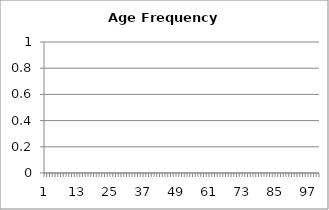
| Category | Series 0 |
|---|---|
| 0 | 0 |
| 1 | 0 |
| 2 | 0 |
| 3 | 0 |
| 4 | 0 |
| 5 | 0 |
| 6 | 0 |
| 7 | 0 |
| 8 | 0 |
| 9 | 0 |
| 10 | 0 |
| 11 | 0 |
| 12 | 0 |
| 13 | 0 |
| 14 | 0 |
| 15 | 0 |
| 16 | 0 |
| 17 | 0 |
| 18 | 0 |
| 19 | 0 |
| 20 | 0 |
| 21 | 0 |
| 22 | 0 |
| 23 | 0 |
| 24 | 0 |
| 25 | 0 |
| 26 | 0 |
| 27 | 0 |
| 28 | 0 |
| 29 | 0 |
| 30 | 0 |
| 31 | 0 |
| 32 | 0 |
| 33 | 0 |
| 34 | 0 |
| 35 | 0 |
| 36 | 0 |
| 37 | 0 |
| 38 | 0 |
| 39 | 0 |
| 40 | 0 |
| 41 | 0 |
| 42 | 0 |
| 43 | 0 |
| 44 | 0 |
| 45 | 0 |
| 46 | 0 |
| 47 | 0 |
| 48 | 0 |
| 49 | 0 |
| 50 | 0 |
| 51 | 0 |
| 52 | 0 |
| 53 | 0 |
| 54 | 0 |
| 55 | 0 |
| 56 | 0 |
| 57 | 0 |
| 58 | 0 |
| 59 | 0 |
| 60 | 0 |
| 61 | 0 |
| 62 | 0 |
| 63 | 0 |
| 64 | 0 |
| 65 | 0 |
| 66 | 0 |
| 67 | 0 |
| 68 | 0 |
| 69 | 0 |
| 70 | 0 |
| 71 | 0 |
| 72 | 0 |
| 73 | 0 |
| 74 | 0 |
| 75 | 0 |
| 76 | 0 |
| 77 | 0 |
| 78 | 0 |
| 79 | 0 |
| 80 | 0 |
| 81 | 0 |
| 82 | 0 |
| 83 | 0 |
| 84 | 0 |
| 85 | 0 |
| 86 | 0 |
| 87 | 0 |
| 88 | 0 |
| 89 | 0 |
| 90 | 0 |
| 91 | 0 |
| 92 | 0 |
| 93 | 0 |
| 94 | 0 |
| 95 | 0 |
| 96 | 0 |
| 97 | 0 |
| 98 | 0 |
| 99 | 0 |